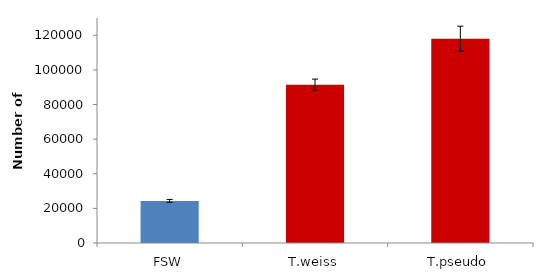
| Category | Series 0 |
|---|---|
| FSW | 24309.329 |
| T.weiss | 91475.743 |
| T.pseudo | 118079.95 |